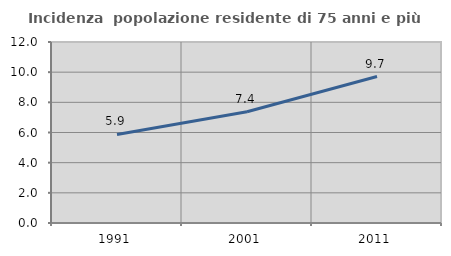
| Category | Incidenza  popolazione residente di 75 anni e più |
|---|---|
| 1991.0 | 5.874 |
| 2001.0 | 7.379 |
| 2011.0 | 9.712 |